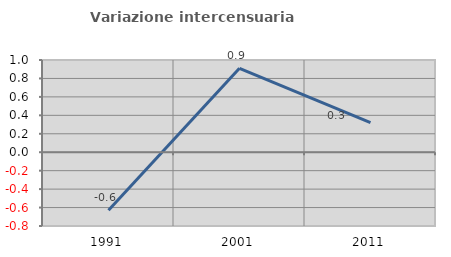
| Category | Variazione intercensuaria annua |
|---|---|
| 1991.0 | -0.63 |
| 2001.0 | 0.91 |
| 2011.0 | 0.32 |